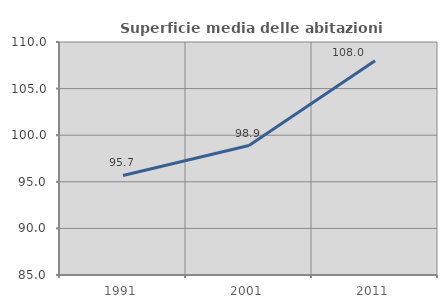
| Category | Superficie media delle abitazioni occupate |
|---|---|
| 1991.0 | 95.681 |
| 2001.0 | 98.894 |
| 2011.0 | 107.986 |